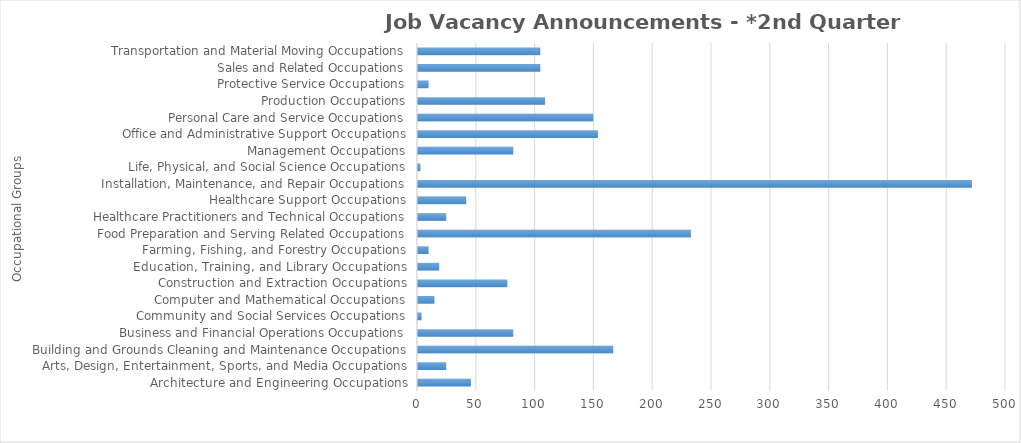
| Category | Total JVAs |
|---|---|
| Architecture and Engineering Occupations | 45 |
| Arts, Design, Entertainment, Sports, and Media Occupations | 24 |
| Building and Grounds Cleaning and Maintenance Occupations | 166 |
| Business and Financial Operations Occupations | 81 |
| Community and Social Services Occupations | 3 |
| Computer and Mathematical Occupations | 14 |
| Construction and Extraction Occupations | 76 |
| Education, Training, and Library Occupations | 18 |
| Farming, Fishing, and Forestry Occupations | 9 |
| Food Preparation and Serving Related Occupations | 232 |
| Healthcare Practitioners and Technical Occupations | 24 |
| Healthcare Support Occupations | 41 |
| Installation, Maintenance, and Repair Occupations | 471 |
| Life, Physical, and Social Science Occupations | 2 |
| Management Occupations | 81 |
| Office and Administrative Support Occupations | 153 |
| Personal Care and Service Occupations | 149 |
| Production Occupations | 108 |
| Protective Service Occupations | 9 |
| Sales and Related Occupations | 104 |
| Transportation and Material Moving Occupations | 104 |